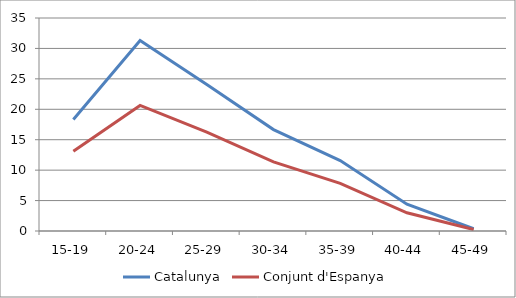
| Category | Catalunya | Conjunt d'Espanya |
|---|---|---|
| 15-19 | 18.322 | 13.111 |
| 20-24 | 31.306 | 20.632 |
| 25-29 | 24.06 | 16.252 |
| 30-34 | 16.668 | 11.362 |
| 35-39 | 11.576 | 7.827 |
| 40-44 | 4.401 | 2.989 |
| 45-49 | 0.368 | 0.247 |